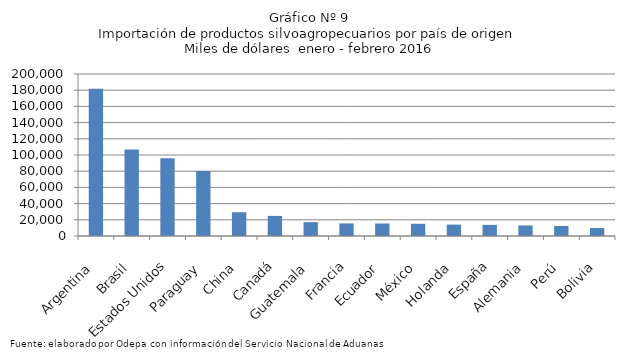
| Category | Series 0 |
|---|---|
| Argentina | 181694.786 |
| Brasil | 106893.683 |
| Estados Unidos | 95881.071 |
| Paraguay | 80158.938 |
| China | 29304.277 |
| Canadá | 24812.126 |
| Guatemala | 17098.541 |
| Francia | 15529.42 |
| Ecuador | 15444.308 |
| México | 15044.102 |
| Holanda | 14083.891 |
| España | 13743.499 |
| Alemania | 13016.514 |
| Perú | 12401.154 |
| Bolivia | 9890.182 |